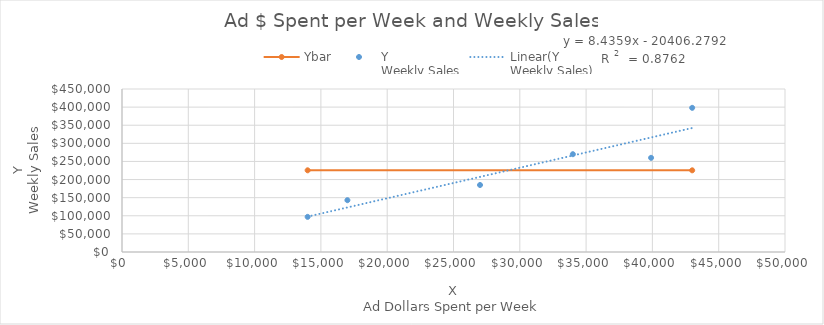
| Category | Ybar |
|---|---|
| 14000.0 | 225500 |
| 43000.0 | 225500 |